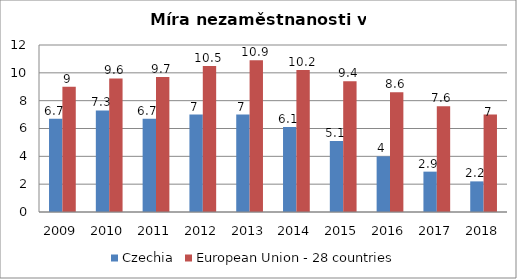
| Category | Czechia | European Union - 28 countries |
|---|---|---|
| 2009 | 6.7 | 9 |
| 2010 | 7.3 | 9.6 |
| 2011 | 6.7 | 9.7 |
| 2012 | 7 | 10.5 |
| 2013 | 7 | 10.9 |
| 2014 | 6.1 | 10.2 |
| 2015 | 5.1 | 9.4 |
| 2016 | 4 | 8.6 |
| 2017 | 2.9 | 7.6 |
| 2018 | 2.2 | 7 |